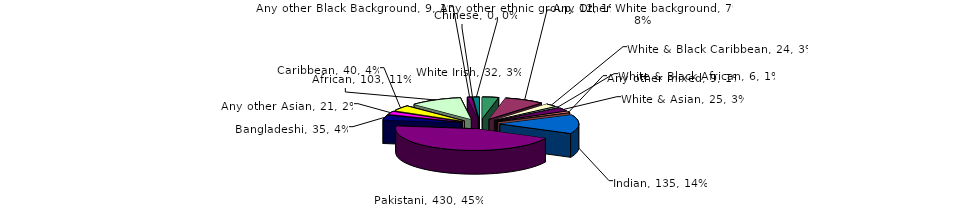
| Category | Series 0 |
|---|---|
| White Irish | 32 |
| Any Other White background | 79 |
| White & Black Caribbean | 24 |
| White & Black African | 6 |
| White & Asian | 25 |
| Any other mixed | 9 |
| Indian | 135 |
| Pakistani | 430 |
| Bangladeshi | 35 |
| Any other Asian | 21 |
| Caribbean | 40 |
| African | 103 |
| Any other Black Background | 9 |
| Chinese | 0 |
| Any other ethnic group | 12 |